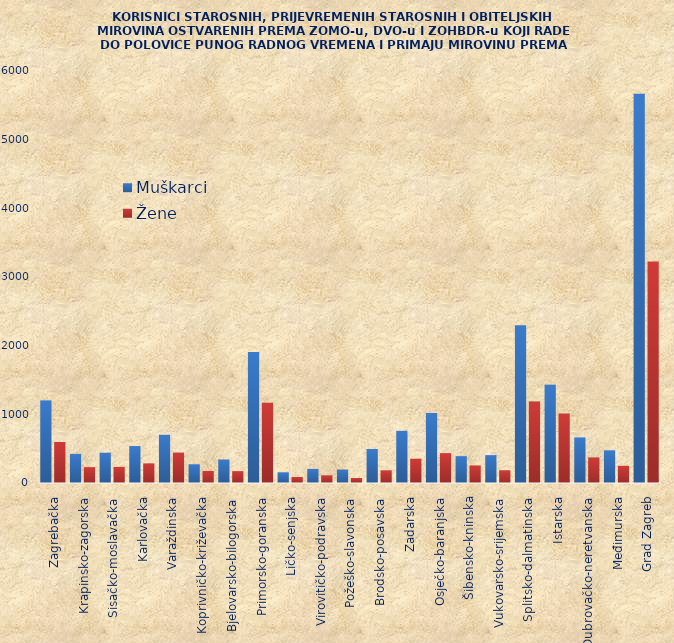
| Category | Muškarci | Žene |
|---|---|---|
| Zagrebačka | 1203 | 597 |
| Krapinsko-zagorska | 424 | 231 |
| Sisačko-moslavačka | 440 | 234 |
| Karlovačka | 538 | 286 |
| Varaždinska | 702 | 442 |
| Koprivničko-križevačka | 273 | 175 |
| Bjelovarsko-bilogorska | 341 | 173 |
| Primorsko-goranska | 1907 | 1168 |
| Ličko-senjska | 156 | 87 |
| Virovitičko-podravska | 205 | 112 |
| Požeško-slavonska | 195 | 73 |
| Brodsko-posavska | 495 | 185 |
| Zadarska | 759 | 353 |
| Osječko-baranjska | 1019 | 435 |
| Šibensko-kninska | 391 | 256 |
| Vukovarsko-srijemska | 406 | 186 |
| Splitsko-dalmatinska | 2298 | 1186 |
| Istarska | 1430 | 1011 |
| Dubrovačko-neretvanska | 664 | 371 |
| Međimurska | 476 | 250 |
| Grad Zagreb | 5668 | 3227 |